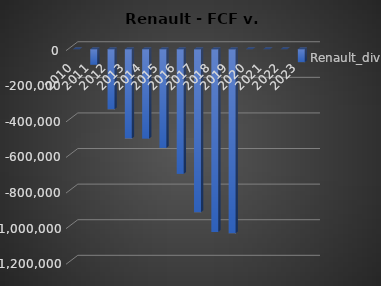
| Category | Renault_div | Renault_FCF |
|---|---|---|
| 2010.0 | 0 |  |
| 2011.0 | -88000 |  |
| 2012.0 | -338000 |  |
| 2013.0 | -502000 |  |
| 2014.0 | -503000 |  |
| 2015.0 | -555000 |  |
| 2016.0 | -701000 |  |
| 2017.0 | -916000 |  |
| 2018.0 | -1027000 |  |
| 2019.0 | -1035000 |  |
| 2020.0 | 0 |  |
| 2021.0 | 0 |  |
| 2022.0 | 0 |  |
| 2023.0 | -73000 |  |